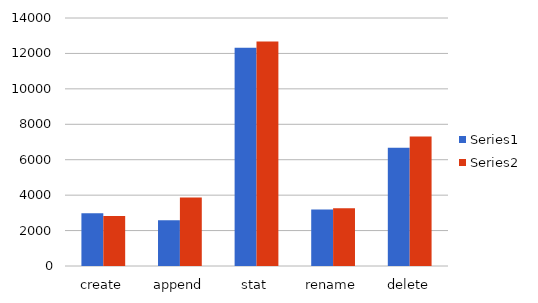
| Category | Series 0 | Series 1 |
|---|---|---|
| create | 2982 | 2816 |
| append | 2586 | 3871 |
| stat | 12318 | 12680 |
| rename | 3195 | 3265 |
| delete | 6682 | 7309 |